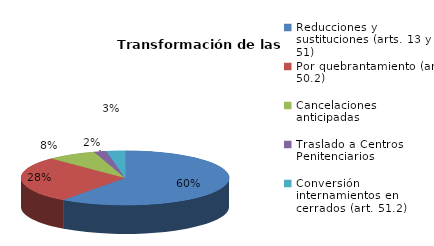
| Category | Series 0 |
|---|---|
| Reducciones y sustituciones (arts. 13 y 51) | 126 |
| Por quebrantamiento (art. 50.2) | 58 |
| Cancelaciones anticipadas | 16 |
| Traslado a Centros Penitenciarios | 4 |
| Conversión internamientos en cerrados (art. 51.2) | 6 |